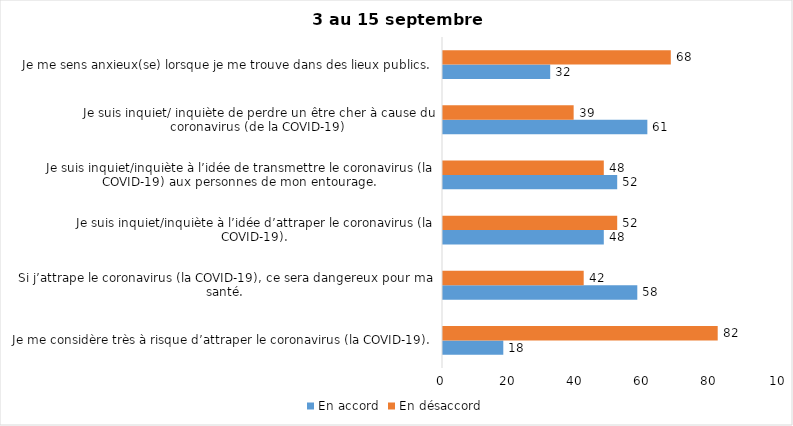
| Category | En accord | En désaccord |
|---|---|---|
| Je me considère très à risque d’attraper le coronavirus (la COVID-19). | 18 | 82 |
| Si j’attrape le coronavirus (la COVID-19), ce sera dangereux pour ma santé. | 58 | 42 |
| Je suis inquiet/inquiète à l’idée d’attraper le coronavirus (la COVID-19). | 48 | 52 |
| Je suis inquiet/inquiète à l’idée de transmettre le coronavirus (la COVID-19) aux personnes de mon entourage. | 52 | 48 |
| Je suis inquiet/ inquiète de perdre un être cher à cause du coronavirus (de la COVID-19) | 61 | 39 |
| Je me sens anxieux(se) lorsque je me trouve dans des lieux publics. | 32 | 68 |